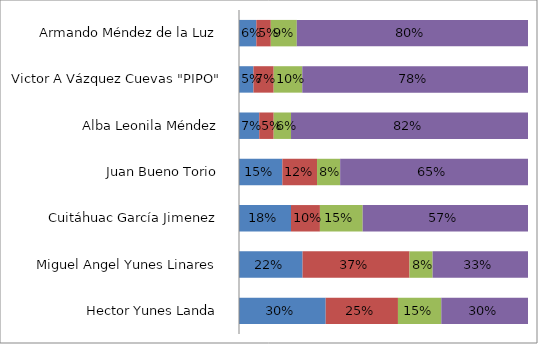
| Category | Series 0 | Series 1 | Series 2 | Series 3 |
|---|---|---|---|---|
| Hector Yunes Landa  | 0.3 | 0.25 | 0.15 | 0.3 |
| Miguel Angel Yunes Linares  | 0.22 | 0.37 | 0.08 | 0.33 |
| Cuitáhuac García Jimenez  | 0.18 | 0.1 | 0.148 | 0.572 |
| Juan Bueno Torio  | 0.15 | 0.12 | 0.08 | 0.65 |
| Alba Leonila Méndez  | 0.07 | 0.05 | 0.06 | 0.82 |
| Victor A Vázquez Cuevas "PIPO" | 0.05 | 0.07 | 0.099 | 0.781 |
| Armando Méndez de la Luz  | 0.06 | 0.05 | 0.09 | 0.8 |